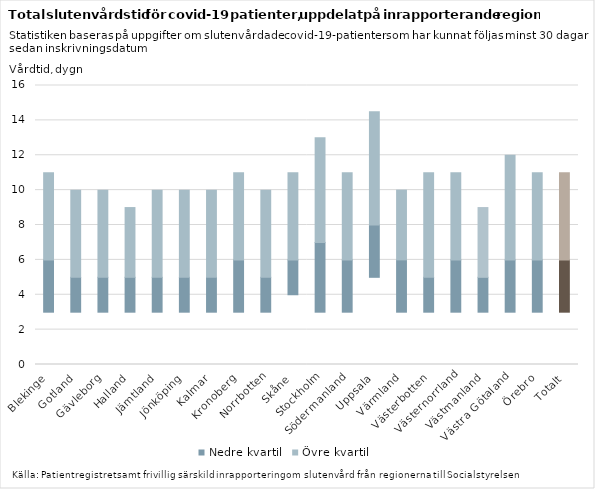
| Category | Series 0 | Nedre kvartil | Övre kvartil |
|---|---|---|---|
| Blekinge | 3 | 3 | 5 |
| Gotland | 3 | 2 | 5 |
| Gävleborg | 3 | 2 | 5 |
| Halland | 3 | 2 | 4 |
| Jämtland | 3 | 2 | 5 |
| Jönköping | 3 | 2 | 5 |
| Kalmar | 3 | 2 | 5 |
| Kronoberg | 3 | 3 | 5 |
| Norrbotten | 3 | 2 | 5 |
| Skåne | 4 | 2 | 5 |
| Stockholm | 3 | 4 | 6 |
| Södermanland | 3 | 3 | 5 |
| Uppsala | 5 | 3 | 6.5 |
| Värmland | 3 | 3 | 4 |
| Västerbotten | 3 | 2 | 6 |
| Västernorrland | 3 | 3 | 5 |
| Västmanland | 3 | 2 | 4 |
| Västra Götaland | 3 | 3 | 6 |
| Örebro | 3 | 3 | 5 |
| Totalt | 3 | 3 | 5 |